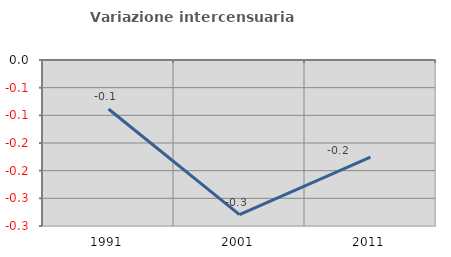
| Category | Variazione intercensuaria annua |
|---|---|
| 1991.0 | -0.089 |
| 2001.0 | -0.28 |
| 2011.0 | -0.175 |